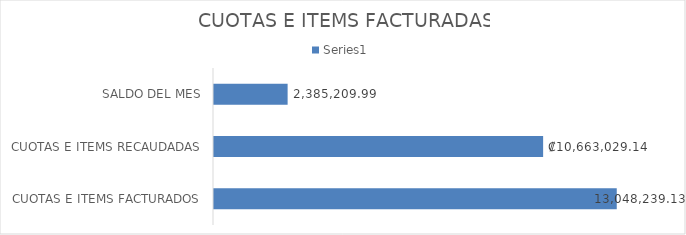
| Category | Series 0 |
|---|---|
| CUOTAS E ITEMS FACTURADOS | 13048239.13 |
| CUOTAS E ITEMS RECAUDADAS | 10663029.14 |
| SALDO DEL MES | 2385209.99 |